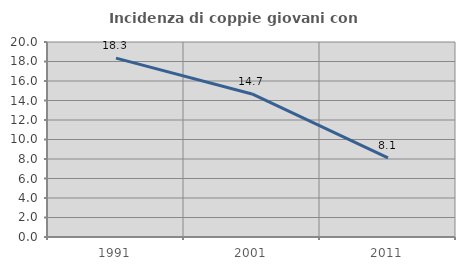
| Category | Incidenza di coppie giovani con figli |
|---|---|
| 1991.0 | 18.345 |
| 2001.0 | 14.67 |
| 2011.0 | 8.115 |